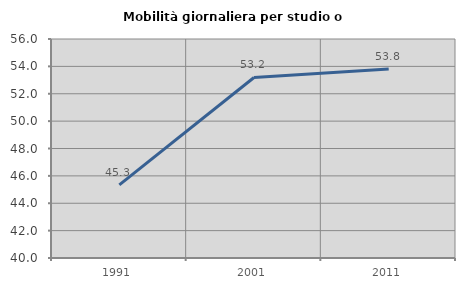
| Category | Mobilità giornaliera per studio o lavoro |
|---|---|
| 1991.0 | 45.337 |
| 2001.0 | 53.189 |
| 2011.0 | 53.815 |